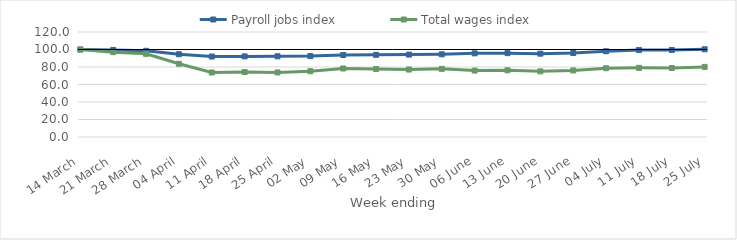
| Category | Payroll jobs index | Total wages index |
|---|---|---|
| 2020-03-14 | 100 | 100 |
| 2020-03-21 | 99.509 | 96.972 |
| 2020-03-28 | 98.495 | 95.055 |
| 2020-04-04 | 94.587 | 83.673 |
| 2020-04-11 | 91.948 | 73.71 |
| 2020-04-18 | 92.116 | 74.248 |
| 2020-04-25 | 92.264 | 73.776 |
| 2020-05-02 | 92.438 | 75.161 |
| 2020-05-09 | 93.749 | 78.332 |
| 2020-05-16 | 93.898 | 77.686 |
| 2020-05-23 | 94.188 | 77.099 |
| 2020-05-30 | 94.493 | 77.903 |
| 2020-06-06 | 95.6 | 75.925 |
| 2020-06-13 | 95.848 | 76.239 |
| 2020-06-20 | 95.237 | 75.01 |
| 2020-06-27 | 96.044 | 76.065 |
| 2020-07-04 | 97.965 | 78.588 |
| 2020-07-11 | 99.472 | 79.005 |
| 2020-07-18 | 99.521 | 78.826 |
| 2020-07-25 | 100.237 | 80.115 |